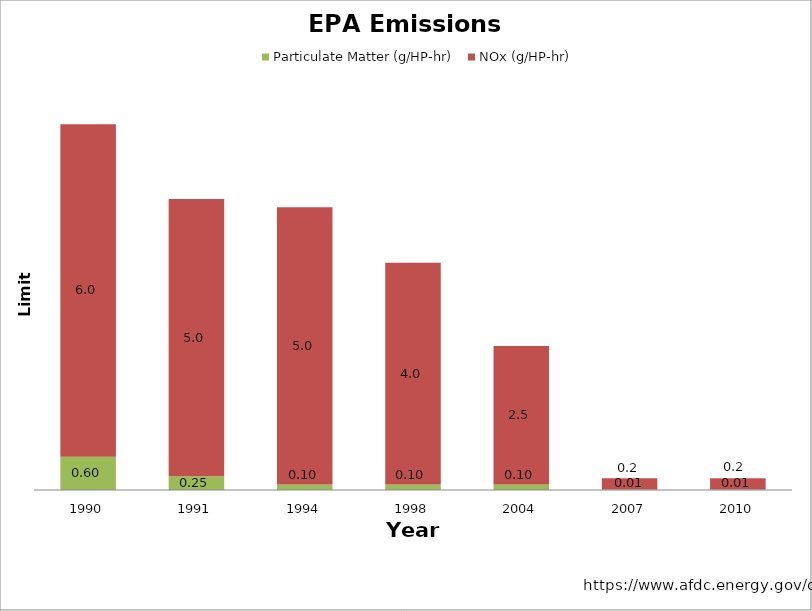
| Category | Particulate Matter (g/HP-hr) | NOx (g/HP-hr) |
|---|---|---|
| 1990.0 | 0.6 | 6 |
| 1991.0 | 0.25 | 5 |
| 1994.0 | 0.1 | 5 |
| 1998.0 | 0.1 | 4 |
| 2004.0 | 0.1 | 2.5 |
| 2007.0 | 0.01 | 0.2 |
| 2010.0 | 0.01 | 0.2 |